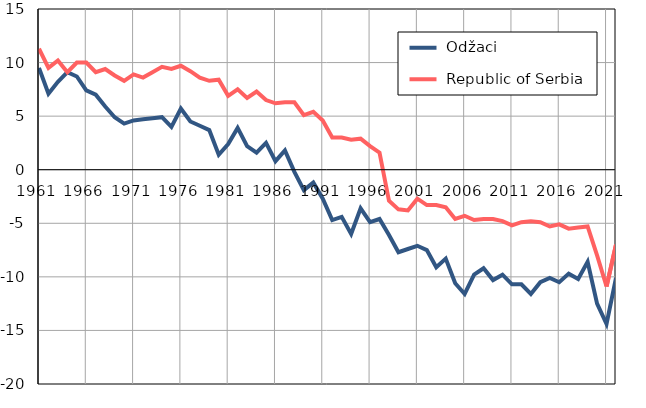
| Category |  Odžaci |  Republic of Serbia |
|---|---|---|
| 1961.0 | 9.5 | 11.3 |
| 1962.0 | 7.1 | 9.5 |
| 1963.0 | 8.2 | 10.2 |
| 1964.0 | 9.1 | 9.1 |
| 1965.0 | 8.7 | 10 |
| 1966.0 | 7.4 | 10 |
| 1967.0 | 7 | 9.1 |
| 1968.0 | 5.9 | 9.4 |
| 1969.0 | 4.9 | 8.8 |
| 1970.0 | 4.3 | 8.3 |
| 1971.0 | 4.6 | 8.9 |
| 1972.0 | 4.7 | 8.6 |
| 1973.0 | 4.8 | 9.1 |
| 1974.0 | 4.9 | 9.6 |
| 1975.0 | 4 | 9.4 |
| 1976.0 | 5.7 | 9.7 |
| 1977.0 | 4.5 | 9.2 |
| 1978.0 | 4.1 | 8.6 |
| 1979.0 | 3.7 | 8.3 |
| 1980.0 | 1.4 | 8.4 |
| 1981.0 | 2.4 | 6.9 |
| 1982.0 | 3.9 | 7.5 |
| 1983.0 | 2.2 | 6.7 |
| 1984.0 | 1.6 | 7.3 |
| 1985.0 | 2.5 | 6.5 |
| 1986.0 | 0.8 | 6.2 |
| 1987.0 | 1.8 | 6.3 |
| 1988.0 | -0.2 | 6.3 |
| 1989.0 | -1.9 | 5.1 |
| 1990.0 | -1.2 | 5.4 |
| 1991.0 | -2.7 | 4.6 |
| 1992.0 | -4.7 | 3 |
| 1993.0 | -4.4 | 3 |
| 1994.0 | -6 | 2.8 |
| 1995.0 | -3.6 | 2.9 |
| 1996.0 | -4.9 | 2.2 |
| 1997.0 | -4.6 | 1.6 |
| 1998.0 | -6.1 | -2.9 |
| 1999.0 | -7.7 | -3.7 |
| 2000.0 | -7.4 | -3.8 |
| 2001.0 | -7.1 | -2.7 |
| 2002.0 | -7.5 | -3.3 |
| 2003.0 | -9.1 | -3.3 |
| 2004.0 | -8.3 | -3.5 |
| 2005.0 | -10.6 | -4.6 |
| 2006.0 | -11.6 | -4.3 |
| 2007.0 | -9.8 | -4.7 |
| 2008.0 | -9.2 | -4.6 |
| 2009.0 | -10.3 | -4.6 |
| 2010.0 | -9.8 | -4.8 |
| 2011.0 | -10.7 | -5.2 |
| 2012.0 | -10.7 | -4.9 |
| 2013.0 | -11.6 | -4.8 |
| 2014.0 | -10.5 | -4.9 |
| 2015.0 | -10.1 | -5.3 |
| 2016.0 | -10.5 | -5.1 |
| 2017.0 | -9.7 | -5.5 |
| 2018.0 | -10.2 | -5.4 |
| 2019.0 | -8.6 | -5.3 |
| 2020.0 | -12.5 | -8 |
| 2021.0 | -14.4 | -10.9 |
| 2022.0 | -10.1 | -7 |